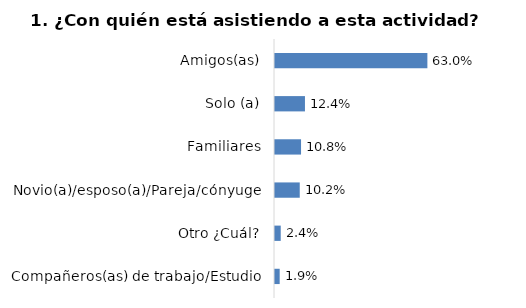
| Category | Series 0 |
|---|---|
| Amigos(as) | 0.63 |
| Solo (a) | 0.124 |
| Familiares | 0.108 |
| Novio(a)/esposo(a)/Pareja/cónyuge | 0.102 |
| Otro ¿Cuál? | 0.024 |
| Compañeros(as) de trabajo/Estudio | 0.019 |